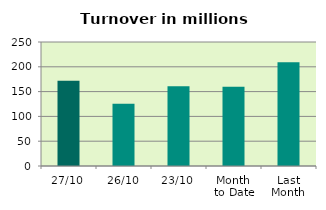
| Category | Series 0 |
|---|---|
| 27/10 | 171.901 |
| 26/10 | 125.442 |
| 23/10 | 160.711 |
| Month 
to Date | 160.015 |
| Last
Month | 209.117 |